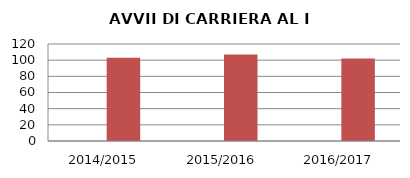
| Category | ANNO | NUMERO |
|---|---|---|
| 2014/2015 | 0 | 103 |
| 2015/2016 | 0 | 107 |
| 2016/2017 | 0 | 102 |